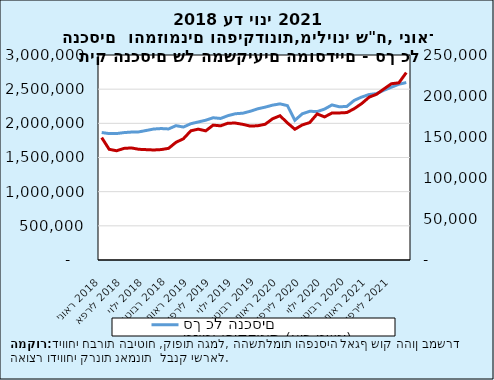
| Category | סך כל הנכסים  |
|---|---|
| 2018-01-31 | 1865568 |
| 2018-02-28 | 1849866 |
| 2018-03-31 | 1850306 |
| 2018-04-30 | 1864437 |
| 2018-05-31 | 1872190 |
| 2018-06-30 | 1874990 |
| 2018-07-31 | 1895520 |
| 2018-08-31 | 1916754 |
| 2018-09-30 | 1923670 |
| 2018-10-31 | 1917819 |
| 2018-11-30 | 1965966 |
| 2018-12-31 | 1945724 |
| 2019-01-31 | 1994695 |
| 2019-02-28 | 2020101 |
| 2019-03-31 | 2045410 |
| 2019-04-30 | 2081910 |
| 2019-05-31 | 2071088 |
| 2019-06-30 | 2112456 |
| 2019-07-31 | 2140408 |
| 2019-08-31 | 2148293 |
| 2019-09-30 | 2176926 |
| 2019-10-31 | 2212615 |
| 2019-11-30 | 2236759 |
| 2019-12-31 | 2266139 |
| 2020-01-31 | 2284860 |
| 2020-02-29 | 2259191 |
| 2020-03-31 | 2044034 |
| 2020-04-30 | 2139455 |
| 2020-05-31 | 2176671 |
| 2020-06-30 | 2172115 |
| 2020-07-31 | 2208773 |
| 2020-08-31 | 2269405 |
| 2020-09-30 | 2241910 |
| 2020-10-31 | 2247692 |
| 2020-11-30 | 2336542 |
| 2020-12-31 | 2384911 |
| 2021-01-31 | 2421639 |
| 2021-02-28 | 2435277 |
| 2021-03-31 | 2484132 |
| 2021-04-30 | 2528993 |
| 2021-05-31 | 2572061 |
| 2021-06-30 | 2596872 |